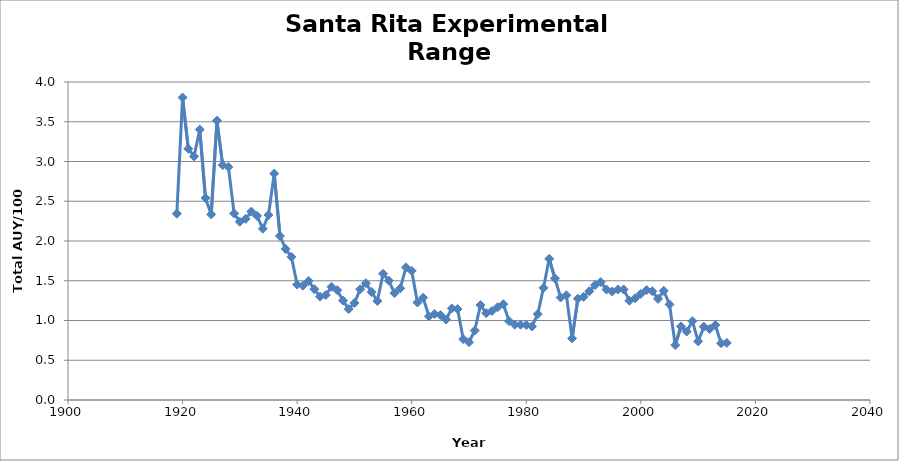
| Category | Series 0 |
|---|---|
| 1919.0 | 2.344 |
| 1920.0 | 3.805 |
| 1921.0 | 3.16 |
| 1922.0 | 3.064 |
| 1923.0 | 3.402 |
| 1924.0 | 2.541 |
| 1925.0 | 2.335 |
| 1926.0 | 3.514 |
| 1927.0 | 2.954 |
| 1928.0 | 2.932 |
| 1929.0 | 2.347 |
| 1930.0 | 2.242 |
| 1931.0 | 2.279 |
| 1932.0 | 2.37 |
| 1933.0 | 2.316 |
| 1934.0 | 2.154 |
| 1935.0 | 2.327 |
| 1936.0 | 2.848 |
| 1937.0 | 2.063 |
| 1938.0 | 1.899 |
| 1939.0 | 1.8 |
| 1940.0 | 1.452 |
| 1941.0 | 1.439 |
| 1942.0 | 1.497 |
| 1943.0 | 1.393 |
| 1944.0 | 1.299 |
| 1945.0 | 1.32 |
| 1946.0 | 1.424 |
| 1947.0 | 1.382 |
| 1948.0 | 1.251 |
| 1949.0 | 1.143 |
| 1950.0 | 1.221 |
| 1951.0 | 1.393 |
| 1952.0 | 1.469 |
| 1953.0 | 1.358 |
| 1954.0 | 1.245 |
| 1955.0 | 1.587 |
| 1956.0 | 1.501 |
| 1957.0 | 1.344 |
| 1958.0 | 1.405 |
| 1959.0 | 1.669 |
| 1960.0 | 1.625 |
| 1961.0 | 1.226 |
| 1962.0 | 1.287 |
| 1963.0 | 1.053 |
| 1964.0 | 1.082 |
| 1965.0 | 1.068 |
| 1966.0 | 1.012 |
| 1967.0 | 1.152 |
| 1968.0 | 1.144 |
| 1969.0 | 0.765 |
| 1970.0 | 0.727 |
| 1971.0 | 0.874 |
| 1972.0 | 1.194 |
| 1973.0 | 1.092 |
| 1974.0 | 1.119 |
| 1975.0 | 1.167 |
| 1976.0 | 1.205 |
| 1977.0 | 0.992 |
| 1978.0 | 0.947 |
| 1979.0 | 0.947 |
| 1980.0 | 0.943 |
| 1981.0 | 0.926 |
| 1982.0 | 1.08 |
| 1983.0 | 1.411 |
| 1984.0 | 1.776 |
| 1985.0 | 1.53 |
| 1986.0 | 1.289 |
| 1987.0 | 1.317 |
| 1988.0 | 0.775 |
| 1989.0 | 1.274 |
| 1990.0 | 1.297 |
| 1991.0 | 1.368 |
| 1992.0 | 1.445 |
| 1993.0 | 1.483 |
| 1994.0 | 1.39 |
| 1995.0 | 1.365 |
| 1996.0 | 1.39 |
| 1997.0 | 1.39 |
| 1998.0 | 1.249 |
| 1999.0 | 1.28 |
| 2000.0 | 1.335 |
| 2001.0 | 1.382 |
| 2002.0 | 1.369 |
| 2003.0 | 1.272 |
| 2004.0 | 1.374 |
| 2005.0 | 1.202 |
| 2006.0 | 0.691 |
| 2007.0 | 0.926 |
| 2008.0 | 0.861 |
| 2009.0 | 0.991 |
| 2010.0 | 0.738 |
| 2011.0 | 0.922 |
| 2012.0 | 0.892 |
| 2013.0 | 0.943 |
| 2014.0 | 0.714 |
| 2015.0 | 0.718 |